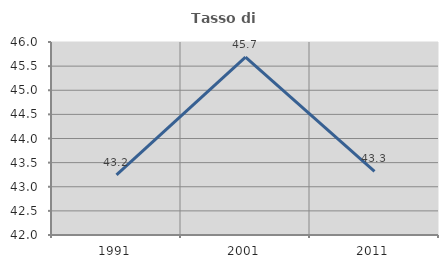
| Category | Tasso di occupazione   |
|---|---|
| 1991.0 | 43.247 |
| 2001.0 | 45.687 |
| 2011.0 | 43.317 |